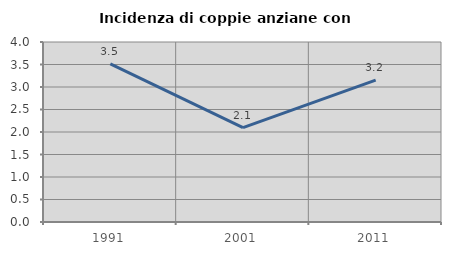
| Category | Incidenza di coppie anziane con figli |
|---|---|
| 1991.0 | 3.516 |
| 2001.0 | 2.098 |
| 2011.0 | 3.152 |